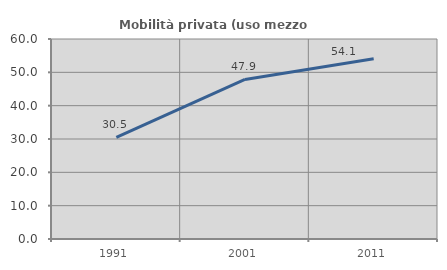
| Category | Mobilità privata (uso mezzo privato) |
|---|---|
| 1991.0 | 30.493 |
| 2001.0 | 47.863 |
| 2011.0 | 54.104 |